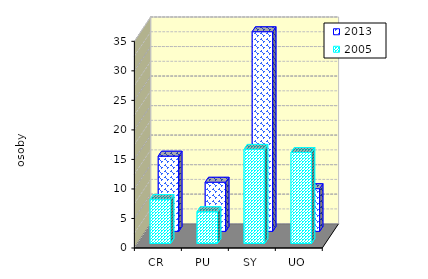
| Category | 2013 | 2005 |
|---|---|---|
| CR | 12.741 | 7.469 |
| PU | 8.328 | 5.389 |
| SY | 33.81 | 15.956 |
| UO | 7.232 | 15.421 |